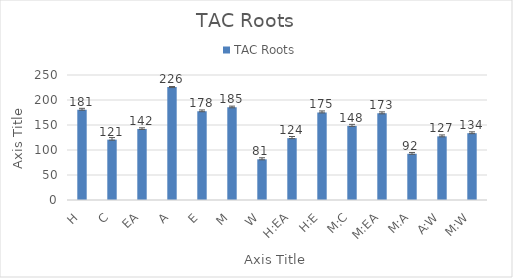
| Category | TAC Roots    |
|---|---|
| H | 180.642 |
| C | 120.676 |
| EA | 142.089 |
| A | 225.841 |
| E | 177.558 |
| M | 185.39 |
| W | 81.359 |
| H:EA | 123.68 |
| H:E | 175.185 |
| M:C | 148.206 |
| M:EA | 173.331 |
| M:A | 92.435 |
| A:W | 127.285 |
| M:W | 133.632 |